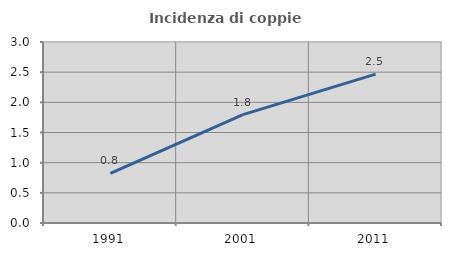
| Category | Incidenza di coppie miste |
|---|---|
| 1991.0 | 0.823 |
| 2001.0 | 1.796 |
| 2011.0 | 2.467 |